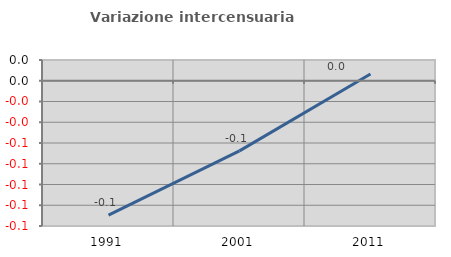
| Category | Variazione intercensuaria annua |
|---|---|
| 1991.0 | -0.129 |
| 2001.0 | -0.068 |
| 2011.0 | 0.007 |